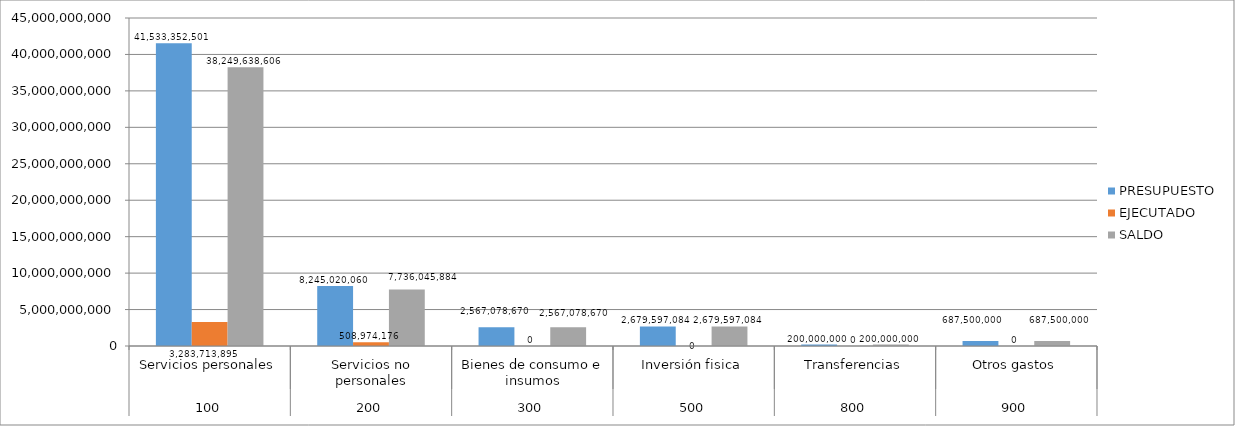
| Category | PRESUPUESTO | EJECUTADO | SALDO |
|---|---|---|---|
| 0 | 41533352501 | 3283713895 | 38249638606 |
| 1 | 8245020060 | 508974176 | 7736045884 |
| 2 | 2567078670 | 0 | 2567078670 |
| 3 | 2679597084 | 0 | 2679597084 |
| 4 | 200000000 | 0 | 200000000 |
| 5 | 687500000 | 0 | 687500000 |